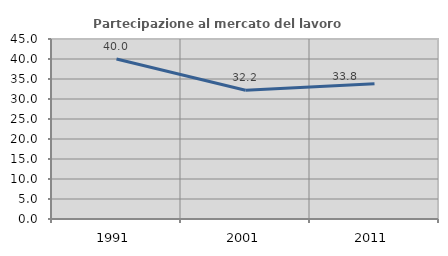
| Category | Partecipazione al mercato del lavoro  femminile |
|---|---|
| 1991.0 | 39.986 |
| 2001.0 | 32.187 |
| 2011.0 | 33.805 |